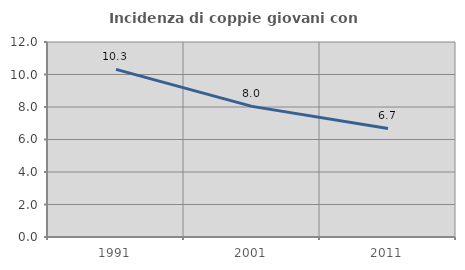
| Category | Incidenza di coppie giovani con figli |
|---|---|
| 1991.0 | 10.314 |
| 2001.0 | 8.038 |
| 2011.0 | 6.683 |